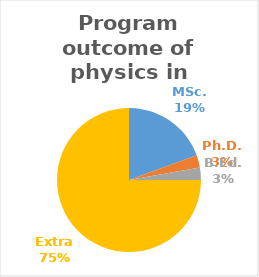
| Category | Series 0 |
|---|---|
| MSc. | 7 |
| Ph.D. | 1 |
| B.Ed. | 1 |
| Extra | 27 |